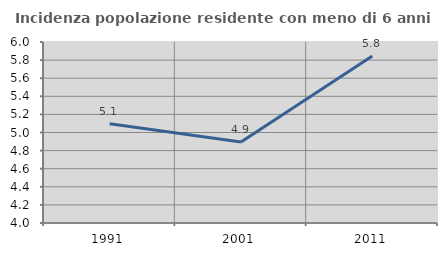
| Category | Incidenza popolazione residente con meno di 6 anni |
|---|---|
| 1991.0 | 5.096 |
| 2001.0 | 4.896 |
| 2011.0 | 5.847 |